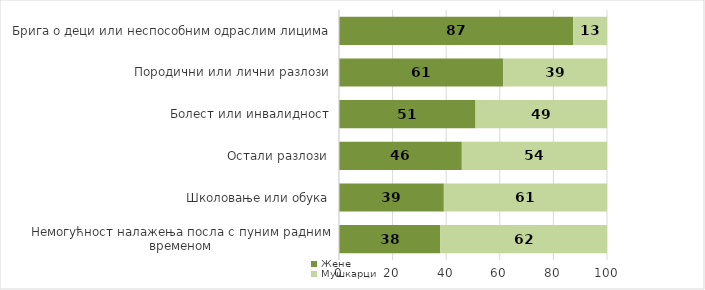
| Category | Жене | Мушкарци |
|---|---|---|
| Немогућност налажења посла с пуним радним временом | 37.711 | 62.289 |
| Школовање или обука | 39.119 | 60.881 |
| Остали разлози | 45.831 | 54.169 |
| Болест или инвалидност | 50.942 | 49.058 |
| Породични или лични разлози | 61.252 | 38.748 |
| Брига о деци или неспособним одраслим лицима | 87.425 | 12.575 |